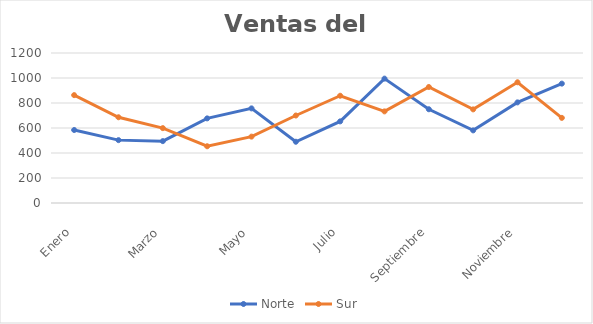
| Category | Norte | Sur |
|---|---|---|
| Enero | 584 | 863 |
| Febrero | 503 | 686 |
| Marzo | 495 | 599 |
| Abril | 677 | 454 |
| Mayo | 757 | 531 |
| Junio | 490 | 700 |
| Julio | 653 | 858 |
| Agosto | 995 | 733 |
| Septiembre | 750 | 928 |
| Octubre | 581 | 749 |
| Noviembre | 805 | 966 |
| Diciembre | 955 | 681 |